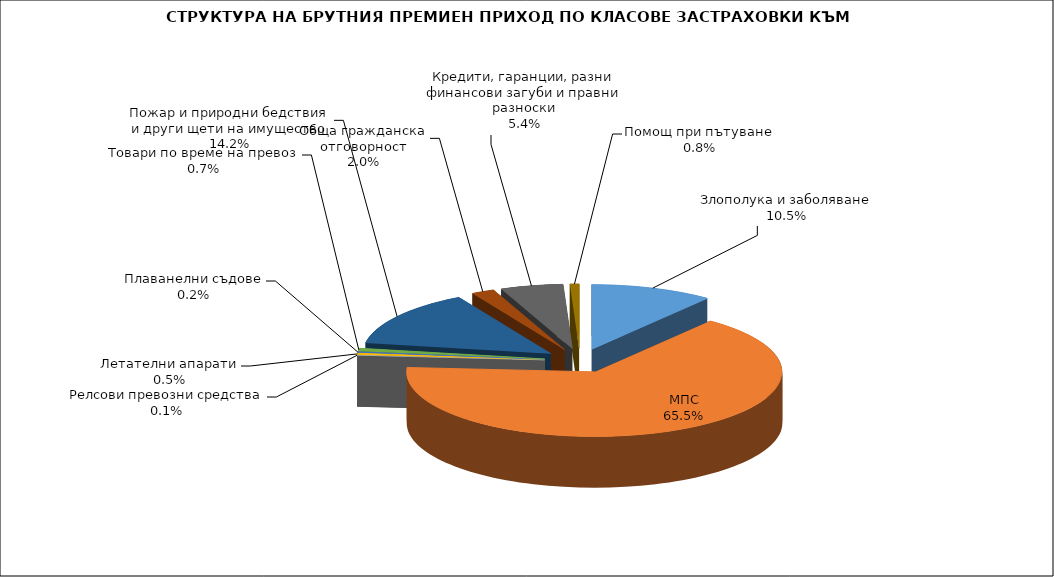
| Category | Злополука и заболяване |
|---|---|
| Злополука и заболяване | 0.105 |
| МПС | 0.655 |
| Релсови превозни средства | 0.001 |
| Летателни апарати | 0.005 |
| Плаванелни съдове | 0.002 |
| Товари по време на превоз | 0.007 |
| Пожар и природни бедствия и други щети на имущество | 0.142 |
| Обща гражданска отговорност | 0.02 |
| Кредити, гаранции, разни финансови загуби и правни разноски | 0.054 |
| Помощ при пътуване | 0.008 |